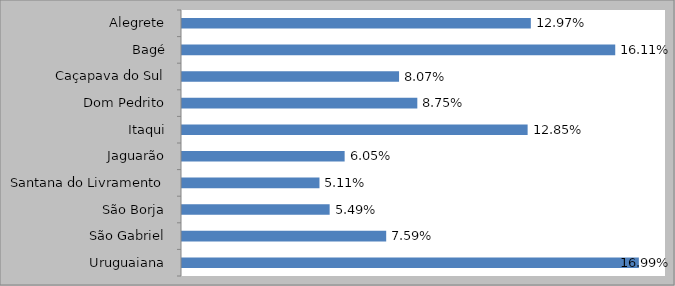
| Category | MATRIZ 2014
(% de Alunos Equivalentes) |
|---|---|
| Alegrete | 0.13 |
| Bagé | 0.161 |
| Caçapava do Sul | 0.081 |
| Dom Pedrito | 0.088 |
| Itaqui | 0.129 |
| Jaguarão | 0.06 |
| Santana do Livramento | 0.051 |
| São Borja | 0.055 |
| São Gabriel | 0.076 |
| Uruguaiana | 0.17 |